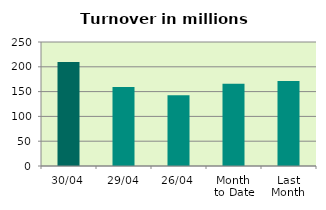
| Category | Series 0 |
|---|---|
| 30/04 | 209.926 |
| 29/04 | 159.358 |
| 26/04 | 142.705 |
| Month 
to Date | 165.638 |
| Last
Month | 171.15 |